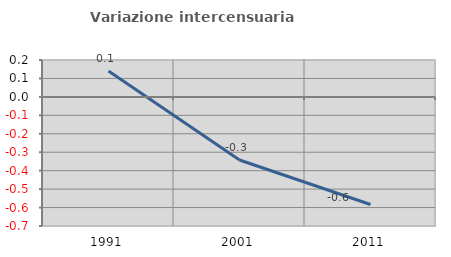
| Category | Variazione intercensuaria annua |
|---|---|
| 1991.0 | 0.14 |
| 2001.0 | -0.342 |
| 2011.0 | -0.583 |